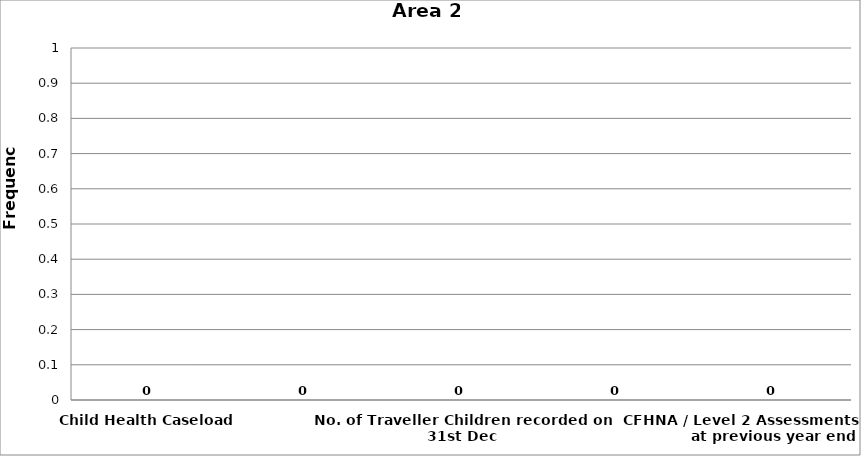
| Category | Area 2 |
|---|---|
| Child Health Caseload | 0 |
| No. of Roma Children recorded on 31st Dec | 0 |
| No. of Traveller Children recorded on 31st Dec | 0 |
| Homeless Children recorded on 31st Dec | 0 |
| CFHNA / Level 2 Assessments in place at previous year end | 0 |